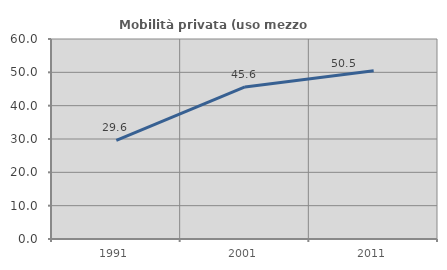
| Category | Mobilità privata (uso mezzo privato) |
|---|---|
| 1991.0 | 29.606 |
| 2001.0 | 45.609 |
| 2011.0 | 50.48 |